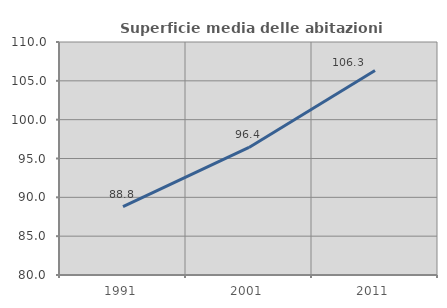
| Category | Superficie media delle abitazioni occupate |
|---|---|
| 1991.0 | 88.804 |
| 2001.0 | 96.424 |
| 2011.0 | 106.331 |